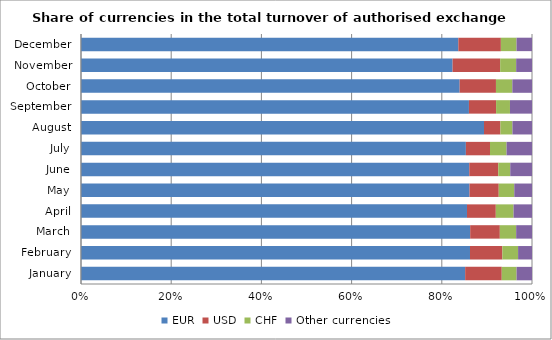
| Category | EUR | USD | CHF | Other currencies |
|---|---|---|---|---|
| January | 0.852 | 0.081 | 0.033 | 0.034 |
| February | 0.863 | 0.072 | 0.035 | 0.031 |
| March | 0.863 | 0.066 | 0.036 | 0.035 |
| April | 0.856 | 0.064 | 0.039 | 0.041 |
| May | 0.861 | 0.065 | 0.034 | 0.039 |
| June | 0.861 | 0.064 | 0.026 | 0.048 |
| July | 0.853 | 0.054 | 0.037 | 0.056 |
| August | 0.894 | 0.036 | 0.027 | 0.043 |
| September | 0.86 | 0.06 | 0.031 | 0.049 |
| October | 0.84 | 0.08 | 0.036 | 0.044 |
| November | 0.824 | 0.105 | 0.035 | 0.035 |
| December | 0.837 | 0.094 | 0.035 | 0.034 |